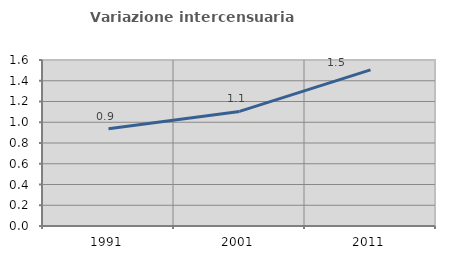
| Category | Variazione intercensuaria annua |
|---|---|
| 1991.0 | 0.938 |
| 2001.0 | 1.104 |
| 2011.0 | 1.505 |